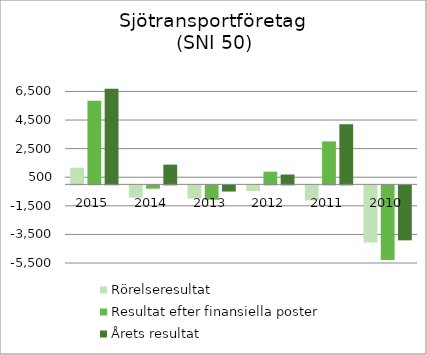
| Category | Rörelseresultat | Resultat efter finansiella poster | Årets resultat |
|---|---|---|---|
| 2015.0 | 1168.983 | 5855.123 | 6686.685 |
| 2014.0 | -859.04 | -231.797 | 1381.89 |
| 2013.0 | -920.448 | -1008.326 | -432.231 |
| 2012.0 | -396.67 | 888.86 | 689.281 |
| 2011.0 | -1054.89 | 3008 | 4206 |
| 2010.0 | -3993.031 | -5217.816 | -3845.881 |